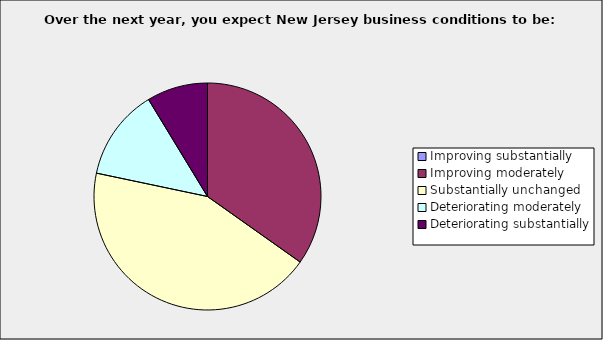
| Category | Series 0 |
|---|---|
| Improving substantially | 0 |
| Improving moderately | 0.348 |
| Substantially unchanged | 0.435 |
| Deteriorating moderately | 0.13 |
| Deteriorating substantially | 0.087 |